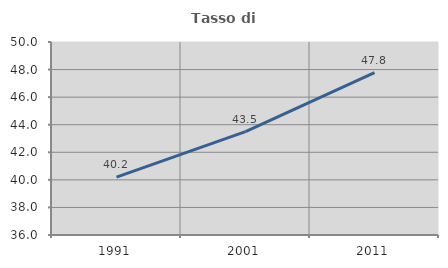
| Category | Tasso di occupazione   |
|---|---|
| 1991.0 | 40.201 |
| 2001.0 | 43.497 |
| 2011.0 | 47.781 |